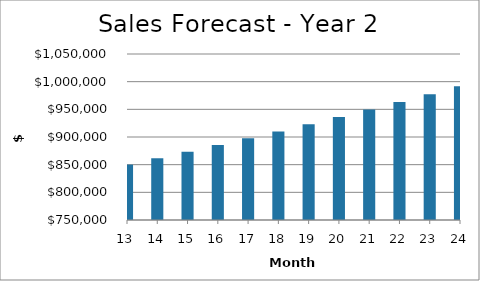
| Category | Year 2 |
|---|---|
| 13.0 | 850088.324 |
| 14.0 | 861584.012 |
| 15.0 | 873327.53 |
| 16.0 | 885328.434 |
| 17.0 | 897596.791 |
| 18.0 | 910143.203 |
| 19.0 | 922978.842 |
| 20.0 | 936115.484 |
| 21.0 | 949565.543 |
| 22.0 | 963342.11 |
| 23.0 | 977458.994 |
| 24.0 | 991930.764 |